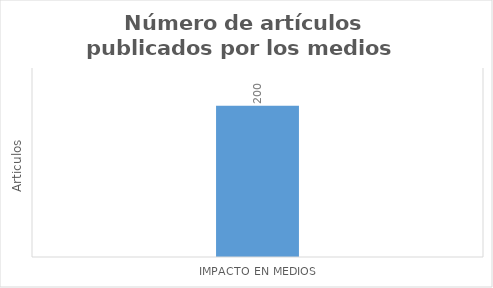
| Category | VP  |
|---|---|
| Impacto en medios | 200 |